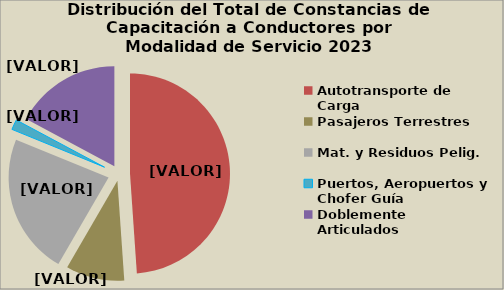
| Category | Series 0 |
|---|---|
| Autotransporte de Carga | 48.903 |
| Pasajeros Terrestres | 9.469 |
| Mat. y Residuos Pelig. | 22.801 |
| Puertos, Aeropuertos y Chofer Guía | 1.645 |
| Doblemente Articulados | 17.182 |